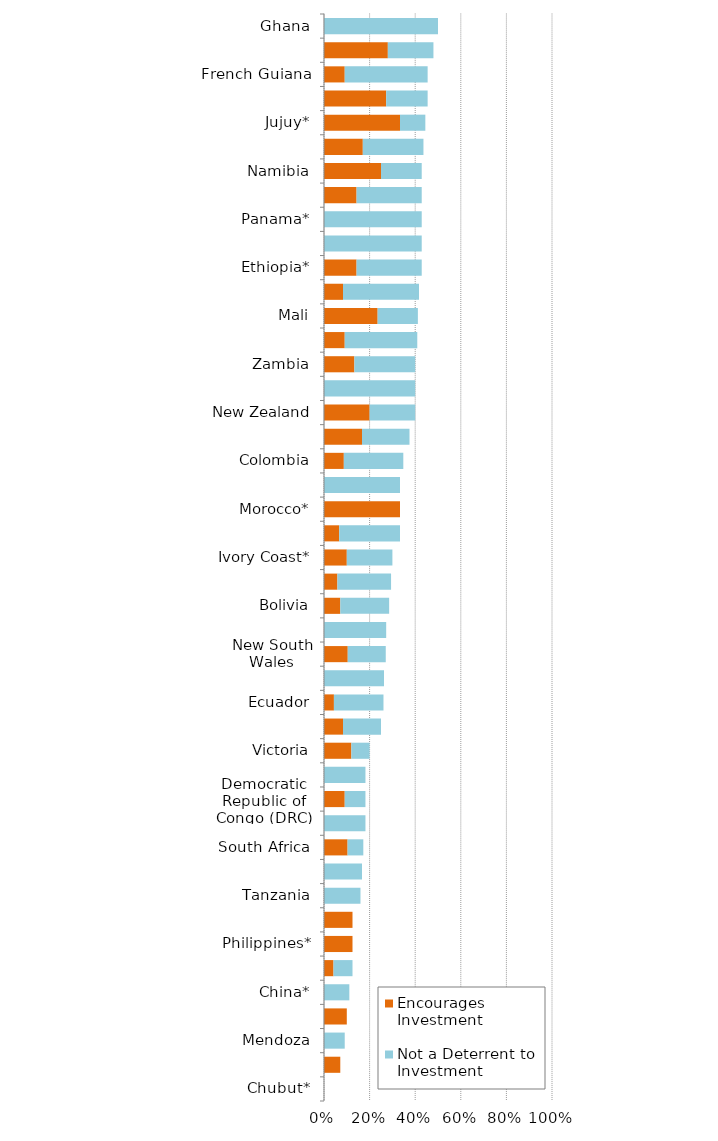
| Category |   Encourages Investment |   Not a Deterrent to Investment |
|---|---|---|
| Chubut* | 0 | 0 |
| Venezuela | 0.071 | 0 |
| Mendoza | 0 | 0.091 |
| Mongolia* | 0.1 | 0 |
| China* | 0 | 0.111 |
| Indonesia | 0.042 | 0.083 |
| Philippines* | 0.125 | 0 |
| Romania* | 0.125 | 0 |
| Tanzania | 0 | 0.16 |
| Zimbabwe | 0 | 0.167 |
| South Africa | 0.103 | 0.069 |
| Montana | 0 | 0.182 |
| Democratic Republic of Congo (DRC) | 0.091 | 0.091 |
| Guatemala | 0 | 0.182 |
| Victoria | 0.12 | 0.08 |
| Turkey | 0.083 | 0.167 |
| Ecuador | 0.043 | 0.217 |
| California | 0 | 0.263 |
| New South Wales | 0.104 | 0.167 |
| Minnesota* | 0 | 0.273 |
| Bolivia | 0.071 | 0.214 |
| Washington | 0.059 | 0.235 |
| Ivory Coast* | 0.1 | 0.2 |
| Papua New Guinea | 0.067 | 0.267 |
| Morocco* | 0.333 | 0 |
| Mozambique* | 0 | 0.333 |
| Colombia | 0.087 | 0.261 |
| Brazil | 0.167 | 0.208 |
| New Zealand | 0.2 | 0.2 |
| Kenya* | 0 | 0.4 |
| Zambia | 0.133 | 0.267 |
| Colorado | 0.091 | 0.318 |
| Mali | 0.235 | 0.176 |
| Burkina Faso | 0.083 | 0.333 |
| Ethiopia* | 0.143 | 0.286 |
| La Rioja* | 0 | 0.429 |
| Panama* | 0 | 0.429 |
| Suriname* | 0.143 | 0.286 |
| Namibia | 0.25 | 0.179 |
| British Columbia | 0.17 | 0.266 |
| Jujuy* | 0.333 | 0.111 |
| Russia* | 0.273 | 0.182 |
| French Guiana | 0.091 | 0.364 |
| Greenland | 0.28 | 0.2 |
| Ghana | 0 | 0.5 |